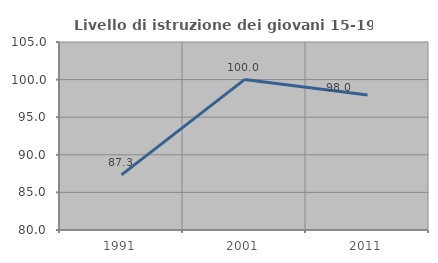
| Category | Livello di istruzione dei giovani 15-19 anni |
|---|---|
| 1991.0 | 87.324 |
| 2001.0 | 100 |
| 2011.0 | 97.959 |